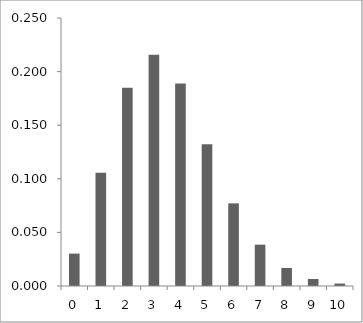
| Category | Series 0 |
|---|---|
| 0.0 | 0.03 |
| 1.0 | 0.106 |
| 2.0 | 0.185 |
| 3.0 | 0.216 |
| 4.0 | 0.189 |
| 5.0 | 0.132 |
| 6.0 | 0.077 |
| 7.0 | 0.039 |
| 8.0 | 0.017 |
| 9.0 | 0.007 |
| 10.0 | 0.002 |